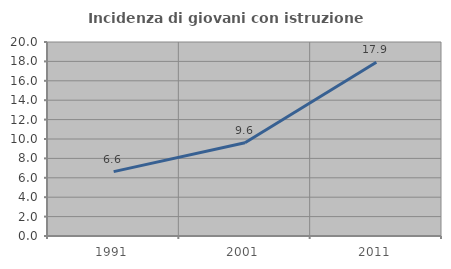
| Category | Incidenza di giovani con istruzione universitaria |
|---|---|
| 1991.0 | 6.634 |
| 2001.0 | 9.615 |
| 2011.0 | 17.91 |